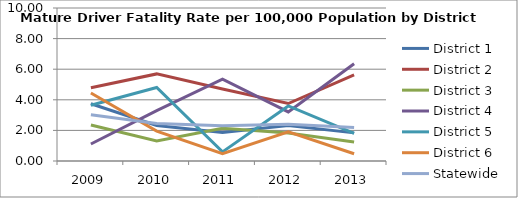
| Category | District 1 | District 2 | District 3 | District 4 | District 5 | District 6 | Statewide |
|---|---|---|---|---|---|---|---|
| 2009.0 | 3.744 | 4.785 | 2.351 | 1.111 | 3.647 | 4.445 | 3.019 |
| 2010.0 | 2.323 | 5.692 | 1.312 | 3.29 | 4.803 | 1.956 | 2.458 |
| 2011.0 | 1.864 | 4.707 | 2.141 | 5.347 | 0.598 | 0.478 | 2.308 |
| 2012.0 | 2.321 | 3.756 | 1.83 | 3.206 | 3.598 | 1.909 | 2.397 |
| 2013.0 | 1.839 | 5.629 | 1.246 | 6.354 | 1.806 | 0.475 | 2.193 |